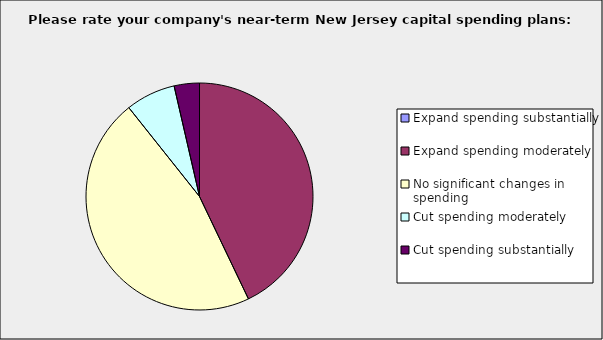
| Category | Series 0 |
|---|---|
| Expand spending substantially | 0 |
| Expand spending moderately | 0.429 |
| No significant changes in spending | 0.464 |
| Cut spending moderately | 0.071 |
| Cut spending substantially | 0.036 |